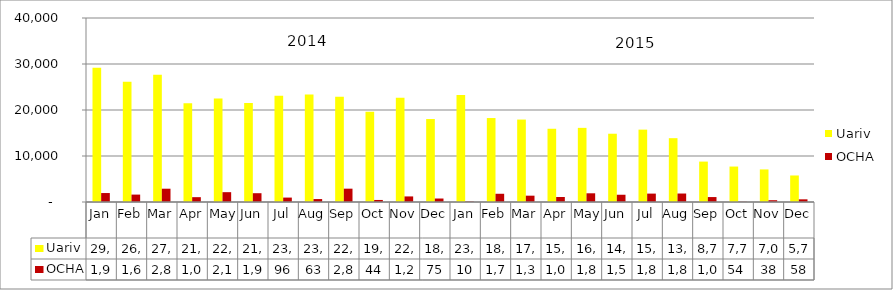
| Category | Uariv | OCHA |
|---|---|---|
| Jan | 29162 | 1948 |
| Feb | 26142 | 1610 |
| Mar | 27644 | 2890 |
| Apr | 21453 | 1051 |
| May | 22494 | 2137 |
| Jun | 21504 | 1912 |
| Jul | 23109 | 961 |
| Aug | 23358 | 639 |
| Sep | 22857 | 2897 |
| Oct | 19643 | 443 |
| Nov | 22673 | 1212 |
| Dec | 18037 | 757 |
| Jan | 23270 | 103 |
| Feb | 18253 | 1790 |
| Mar | 17920 | 1375 |
| Apr | 15921 | 1088 |
| May | 16118 | 1893 |
| Jun | 14842 | 1577 |
| Jul | 15733 | 1826 |
| Aug | 13875 | 1843 |
| Sep | 8785 | 1074 |
| Oct | 7708 | 54 |
| Nov | 7082 | 387 |
| Dec | 5768 | 580 |